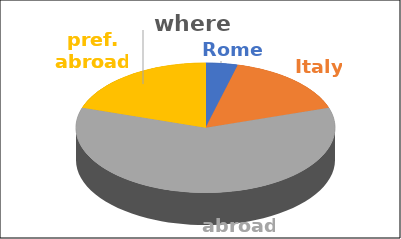
| Category | where | Series 1 | Series 2 | Series 3 | Series 4 |
|---|---|---|---|---|---|
| Rome | 0.04 |  |  |  |  |
| Italy | 0.16 |  |  |  |  |
| abroad | 0.6 |  |  |  |  |
| pref. abroad | 0.2 |  |  |  |  |